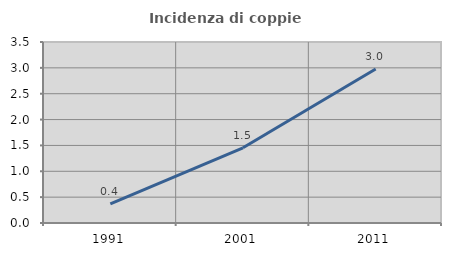
| Category | Incidenza di coppie miste |
|---|---|
| 1991.0 | 0.368 |
| 2001.0 | 1.455 |
| 2011.0 | 2.977 |